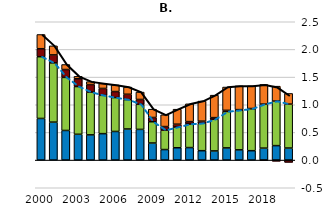
| Category | Capital stock per worker | Trend labour efficiency | Trend working-age population ratio | Trend employment rate |
|---|---|---|---|---|
| 2000.0 | 0.752 | 1.116 | 0.144 | 0.257 |
| 2001.0 | 0.686 | 1.071 | 0.144 | 0.164 |
| 2002.0 | 0.535 | 0.959 | 0.142 | 0.091 |
| 2003.0 | 0.466 | 0.863 | 0.14 | 0.044 |
| 2004.0 | 0.456 | 0.774 | 0.136 | 0.053 |
| 2005.0 | 0.478 | 0.692 | 0.125 | 0.09 |
| 2006.0 | 0.517 | 0.613 | 0.109 | 0.119 |
| 2007.0 | 0.562 | 0.531 | 0.097 | 0.131 |
| 2008.0 | 0.555 | 0.453 | 0.088 | 0.134 |
| 2009.0 | 0.309 | 0.384 | 0.077 | 0.15 |
| 2010.0 | 0.19 | 0.352 | 0.064 | 0.213 |
| 2011.0 | 0.223 | 0.375 | 0.051 | 0.272 |
| 2012.0 | 0.226 | 0.426 | 0.044 | 0.321 |
| 2013.0 | 0.17 | 0.495 | 0.038 | 0.363 |
| 2014.0 | 0.166 | 0.572 | 0.03 | 0.406 |
| 2015.0 | 0.22 | 0.658 | 0.02 | 0.421 |
| 2016.0 | 0.185 | 0.716 | 0.011 | 0.429 |
| 2017.0 | 0.17 | 0.76 | 0.003 | 0.408 |
| 2018.0 | 0.216 | 0.795 | -0.007 | 0.355 |
| 2019.0 | 0.261 | 0.805 | -0.021 | 0.27 |
| 2020.0 | 0.218 | 0.794 | -0.041 | 0.193 |